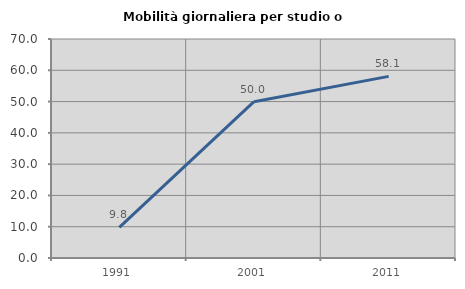
| Category | Mobilità giornaliera per studio o lavoro |
|---|---|
| 1991.0 | 9.763 |
| 2001.0 | 49.957 |
| 2011.0 | 58.056 |